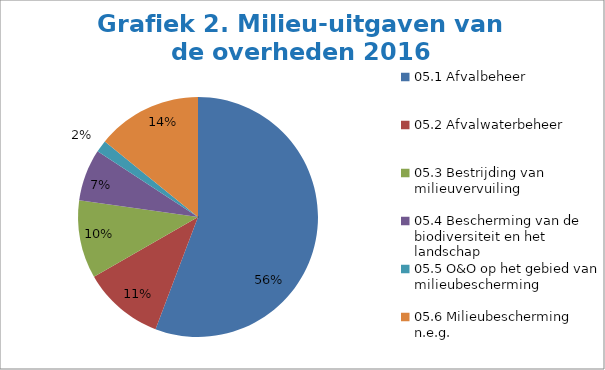
| Category | Series 0 |
|---|---|
| 05.1 Afvalbeheer | 1998 |
| 05.2 Afvalwaterbeheer | 391.7 |
| 05.3 Bestrijding van milieuvervuiling | 377.5 |
| 05.4 Bescherming van de biodiversiteit en het landschap | 250.4 |
| 05.5 O&O op het gebied van milieubescherming | 58.5 |
| 05.6 Milieubescherming n.e.g. | 507.1 |